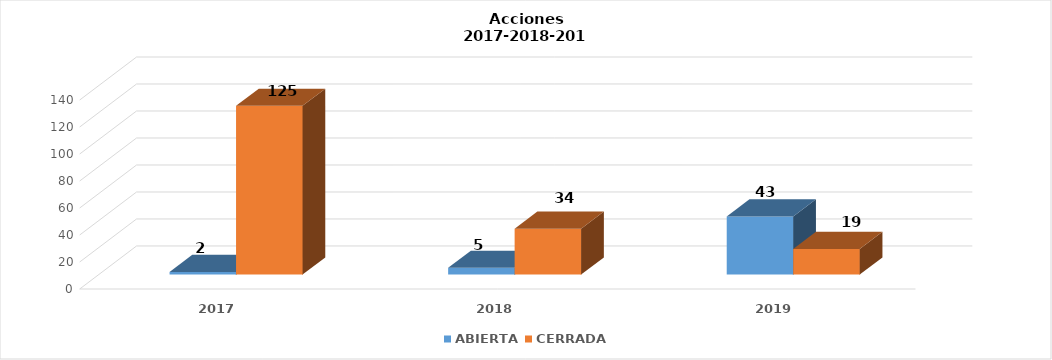
| Category | ABIERTA | CERRADA |
|---|---|---|
| 2017.0 | 2 | 125 |
| 2018.0 | 5 | 34 |
| 2019.0 | 43 | 19 |